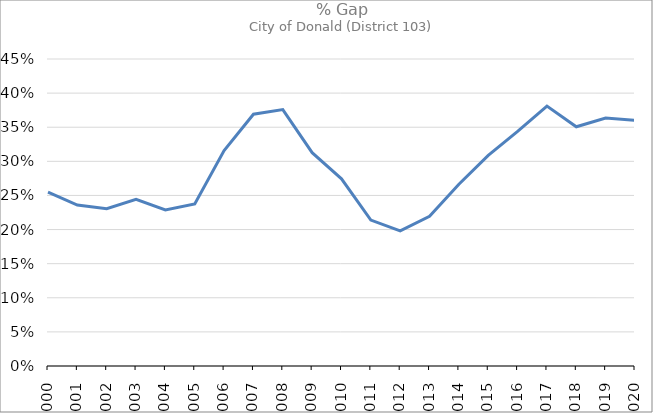
| Category | Series 0 |
|---|---|
| 2000.0 | 0.255 |
| 2001.0 | 0.236 |
| 2002.0 | 0.231 |
| 2003.0 | 0.244 |
| 2004.0 | 0.229 |
| 2005.0 | 0.238 |
| 2006.0 | 0.316 |
| 2007.0 | 0.369 |
| 2008.0 | 0.376 |
| 2009.0 | 0.313 |
| 2010.0 | 0.274 |
| 2011.0 | 0.214 |
| 2012.0 | 0.198 |
| 2013.0 | 0.219 |
| 2014.0 | 0.266 |
| 2015.0 | 0.309 |
| 2016.0 | 0.344 |
| 2017.0 | 0.381 |
| 2018.0 | 0.351 |
| 2019.0 | 0.363 |
| 2020.0 | 0.36 |